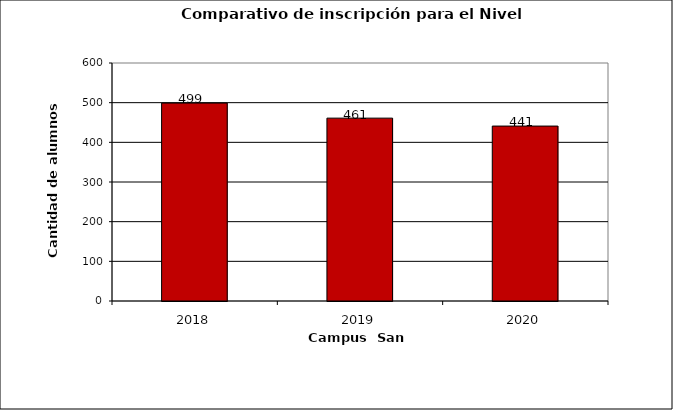
| Category | Series 0 |
|---|---|
| 2018.0 | 499 |
| 2019.0 | 461 |
| 2020.0 | 441 |